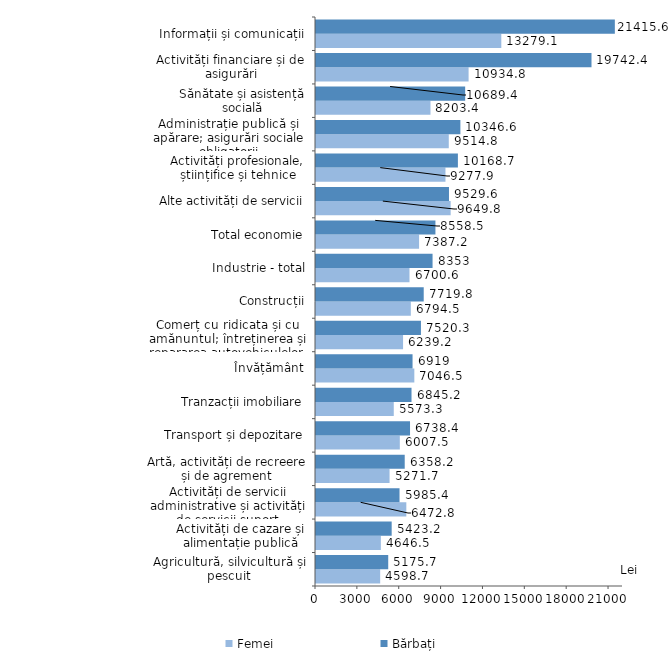
| Category | Femei | Bărbați |
|---|---|---|
| Agricultură, silvicultură și pescuit | 4598.7 | 5175.7 |
| Activități de cazare și alimentație publică | 4646.5 | 5423.2 |
| Activități de servicii administrative și activități de servicii suport | 6472.8 | 5985.4 |
| Artă, activități de recreere și de agrement | 5271.7 | 6358.2 |
| Transport și depozitare | 6007.5 | 6738.4 |
| Tranzacții imobiliare | 5573.3 | 6845.2 |
| Învățământ | 7046.5 | 6919 |
| Comerț cu ridicata și cu amănuntul; întreținerea și repararea autovehiculelor și a motocicletelor | 6239.2 | 7520.3 |
| Construcții | 6794.5 | 7719.8 |
| Industrie - total | 6700.6 | 8353 |
| Total economie | 7387.2 | 8558.5 |
| Alte activități de servicii | 9649.8 | 9529.6 |
| Activități profesionale, științifice și tehnice | 9277.9 | 10168.7 |
| Administrație publică și apărare; asigurări sociale obligatorii | 9514.8 | 10346.6 |
| Sănătate și asistență socială | 8203.4 | 10689.4 |
| Activități financiare și de asigurări | 10934.8 | 19742.4 |
| Informații și comunicații | 13279.1 | 21415.6 |